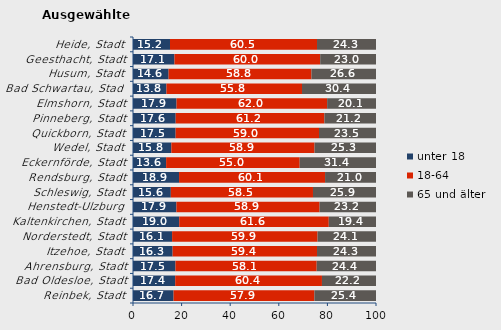
| Category | unter 18 | 18-64 | 65 und älter |
|---|---|---|---|
| Reinbek, Stadt | 16.703 | 57.938 | 25.36 |
| Bad Oldesloe, Stadt | 17.366 | 60.392 | 22.241 |
| Ahrensburg, Stadt | 17.482 | 58.115 | 24.403 |
| Itzehoe, Stadt | 16.308 | 59.419 | 24.272 |
| Norderstedt, Stadt | 16.088 | 59.859 | 24.052 |
| Kaltenkirchen, Stadt | 19.016 | 61.554 | 19.43 |
| Henstedt-Ulzburg | 17.873 | 58.906 | 23.22 |
| Schleswig, Stadt | 15.566 | 58.503 | 25.931 |
| Rendsburg, Stadt | 18.95 | 60.086 | 20.965 |
| Eckernförde, Stadt | 13.628 | 54.967 | 31.405 |
| Wedel, Stadt | 15.78 | 58.927 | 25.294 |
| Quickborn, Stadt | 17.547 | 58.996 | 23.457 |
| Pinneberg, Stadt | 17.568 | 61.2 | 21.232 |
| Elmshorn, Stadt | 17.923 | 61.961 | 20.115 |
| Bad Schwartau, Stadt | 13.758 | 55.794 | 30.448 |
| Husum, Stadt | 14.648 | 58.795 | 26.557 |
| Geesthacht, Stadt | 17.058 | 59.983 | 22.959 |
| Heide, Stadt | 15.226 | 60.502 | 24.272 |